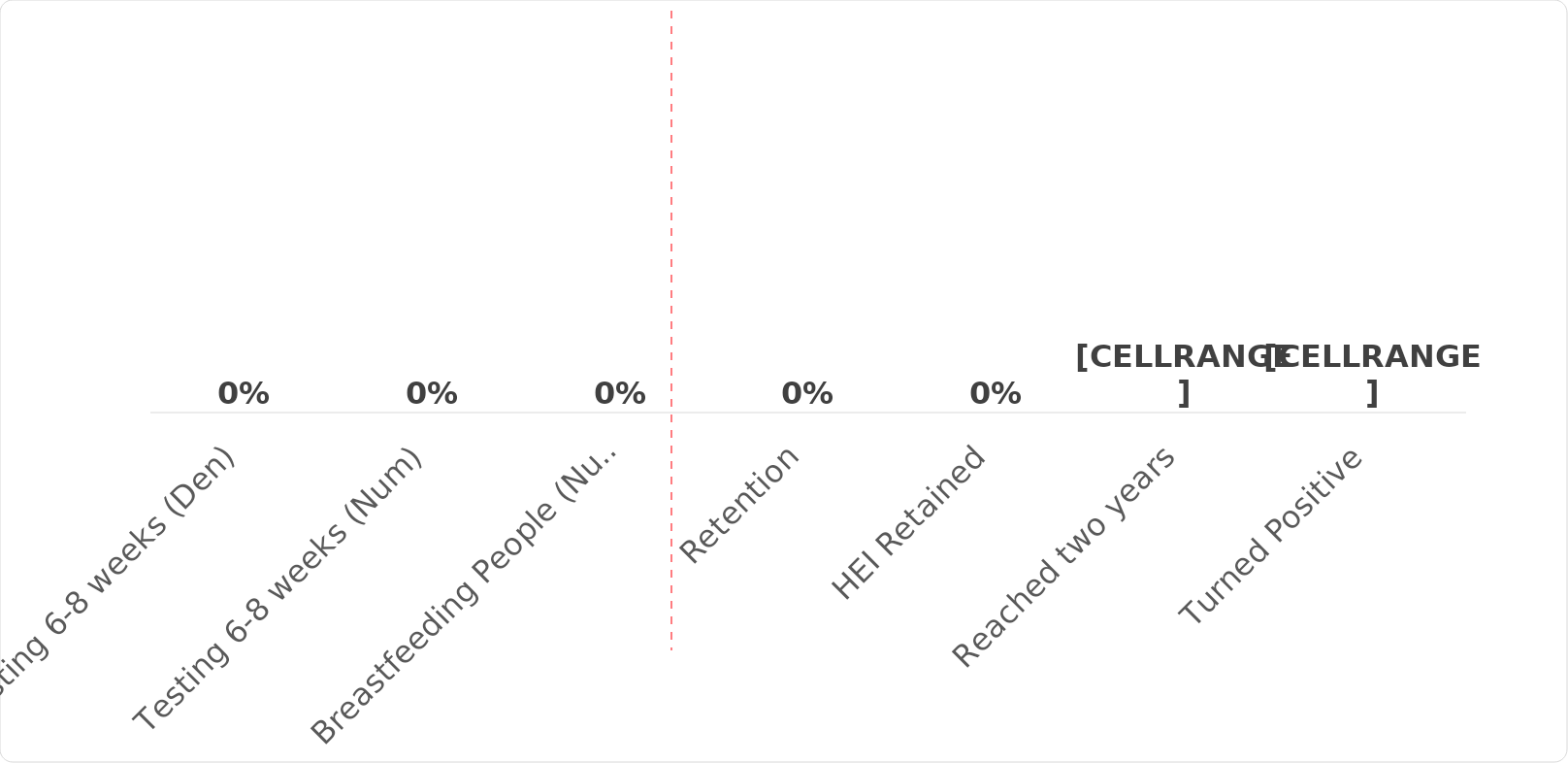
| Category | Total |
|---|---|
| Testing 6-8 weeks (Den) | 0 |
| Testing 6-8 weeks (Num) | 0 |
| Breastfeeding People (Num) | 0 |
| Retention | 0 |
| HEI Retained | 0 |
| Reached two years | 0 |
| Turned Positive | 0 |